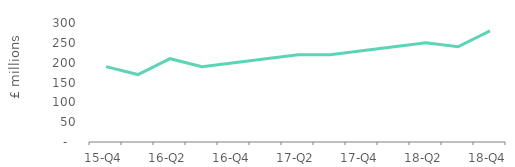
| Category | Full market |
|---|---|
| 15-Q4 | 190 |
| 16-Q1 | 170 |
| 16-Q2 | 210 |
| 16-Q3 | 190 |
| 16-Q4 | 200 |
| 17-Q1 | 210 |
| 17-Q2 | 220 |
| 17-Q3 | 220 |
| 17-Q4 | 230 |
| 18-Q1 | 240 |
| 18-Q2 | 250 |
| 18-Q3 | 240 |
| 18-Q4 | 280 |